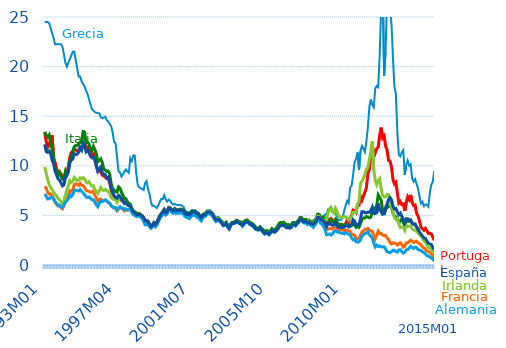
| Category |  Grecia | Portugal | Francia | Italia | Irlanda | Alemania | España |
|---|---|---|---|---|---|---|---|
| 1993M01 | 24.5 | 13.34 | 7.92 | 13.43 | 9.88 | 7.15 | 12.16 |
| 1993M02 | 24.5 | 12.46 | 7.77 | 13.06 | 9.26 | 6.94 | 11.43 |
| 1993M03 | 24.5 | 11.85 | 7.33 | 12.9 | 8.62 | 6.66 | 11.36 |
| 1993M04 | 24.38 | 12.06 | 7.15 | 13.11 | 8.11 | 6.68 | 11.49 |
| 1993M05 | 23.88 | 12.77 | 7.18 | 12.46 | 7.83 | 6.83 | 11.22 |
| 1993M06 | 23.38 | 13.07 | 6.95 | 11.67 | 7.61 | 6.81 | 10.56 |
| 1993M07 | 22.88 | 10.66 | 6.76 | 11.1 | 7.32 | 6.62 | 10.22 |
| 1993M08 | 22.25 | 10.37 | 6.31 | 9.76 | 7.11 | 6.41 | 9.48 |
| 1993M09 | 22.25 | 9.74 | 6.13 | 9.47 | 7.01 | 6.2 | 9.09 |
| 1993M10 | 22.25 | 9.27 | 5.96 | 9.02 | 6.71 | 6 | 8.69 |
| 1993M11 | 22.25 | 9.39 | 6.04 | 9.33 | 6.57 | 5.98 | 8.56 |
| 1993M12 | 22.25 | 9.19 | 5.8 | 8.93 | 6.38 | 5.85 | 8.28 |
| 1994M01 | 22 | 8.93 | 5.67 | 8.67 | 6.15 | 5.8 | 7.98 |
| 1994M02 | 21.25 | 8.58 | 5.94 | 8.77 | 6.45 | 6.07 | 8.07 |
| 1994M03 | 20.38 | 8.97 | 6.37 | 9.44 | 7.07 | 6.34 | 8.82 |
| 1994M04 | 20 | 9.26 | 6.69 | 9.05 | 7.57 | 6.48 | 9.07 |
| 1994M05 | 20.38 | 9.96 | 6.97 | 9.37 | 7.96 | 6.66 | 9.55 |
| 1994M06 | 20.75 | 10.84 | 7.49 | 10.48 | 8.5 | 7.05 | 10.28 |
| 1994M07 | 21.13 | 11.34 | 7.4 | 10.77 | 8.34 | 6.9 | 10.59 |
| 1994M08 | 21.5 | 11.42 | 7.61 | 11.46 | 8.43 | 7.09 | 10.68 |
| 1994M09 | 21.5 | 11.75 | 8.1 | 11.94 | 8.82 | 7.52 | 11.22 |
| 1994M10 | 20.67 | 11.59 | 8.19 | 12.07 | 8.68 | 7.54 | 11.14 |
| 1994M11 | 19.83 | 11.51 | 8.14 | 12.02 | 8.51 | 7.49 | 11.17 |
| 1994M12 | 19 | 11.6 | 8.02 | 12.2 | 8.57 | 7.46 | 11.38 |
| 1995M01 | 19 | 11.79 | 8.23 | 12.37 | 8.79 | 7.6 | 11.86 |
| 1995M02 | 18.5 | 11.7 | 8.01 | 12.39 | 8.67 | 7.42 | 11.6 |
| 1995M03 | 18.25 | 11.98 | 8.02 | 13.45 | 8.8 | 7.28 | 12.26 |
| 1995M04 | 18 | 12.17 | 7.82 | 13.4 | 8.7 | 7.09 | 12.09 |
| 1995M05 | 17.58 | 11.92 | 7.52 | 12.3 | 8.34 | 6.86 | 11.41 |
| 1995M06 | 17.24 | 11.89 | 7.45 | 12.38 | 8.26 | 6.78 | 11.54 |
| 1995M07 | 16.72 | 11.69 | 7.43 | 12.21 | 8.39 | 6.86 | 11.33 |
| 1995M08 | 16.19 | 11.31 | 7.33 | 11.66 | 8.15 | 6.74 | 10.97 |
| 1995M09 | 15.72 | 11.14 | 7.35 | 11.54 | 7.96 | 6.59 | 10.8 |
| 1995M10 | 15.56 | 11.22 | 7.48 | 11.96 | 7.99 | 6.57 | 10.89 |
| 1995M11 | 15.4 | 10.74 | 7.03 | 11.63 | 7.63 | 6.34 | 10.54 |
| 1995M12 | 15.35 | 10.03 | 6.75 | 11.17 | 7.38 | 6.07 | 9.95 |
| 1996M01 | 15.3 | 9.44 | 6.44 | 10.43 | 7.23 | 5.89 | 9.46 |
| 1996M02 | 15.3 | 9.45 | 6.59 | 10.52 | 7.49 | 6.2 | 9.71 |
| 1996M03 | 14.9 | 9.46 | 6.64 | 10.69 | 7.82 | 6.44 | 9.89 |
| 1996M04 | 14.8 | 9.06 | 6.5 | 10.34 | 7.61 | 6.38 | 9.33 |
| 1996M05 | 14.87 | 8.97 | 6.46 | 9.7 | 7.5 | 6.45 | 9.17 |
| 1996M06 | 14.95 | 8.88 | 6.55 | 9.57 | 7.62 | 6.56 | 9.11 |
| 1996M07 | 14.61 | 8.71 | 6.44 | 9.43 | 7.49 | 6.48 | 8.78 |
| 1996M08 | 14.46 | 8.71 | 6.34 | 9.48 | 7.43 | 6.3 | 8.86 |
| 1996M09 | 14.23 | 8.32 | 6.23 | 9.17 | 7.21 | 6.23 | 8.43 |
| 1996M10 | 14 | 7.59 | 5.97 | 8.23 | 6.78 | 6.01 | 7.76 |
| 1996M11 | 13.36 | 7.17 | 5.83 | 7.69 | 6.68 | 5.86 | 7.34 |
| 1996M12 | 12.42 | 6.95 | 5.74 | 7.56 | 6.61 | 5.79 | 7 |
| 1997M01 | 12.29 | 6.72 | 5.68 | 7.38 | 6.59 | 5.8 | 6.83 |
| 1997M02 | 10.87 | 6.66 | 5.46 | 7.36 | 6.32 | 5.55 | 6.74 |
| 1997M03 | 9.45 | 6.87 | 5.65 | 7.87 | 6.62 | 5.71 | 7.03 |
| 1997M04 | 9.33 | 6.8 | 5.8 | 7.74 | 6.69 | 5.87 | 6.95 |
| 1997M05 | 8.92 | 6.49 | 5.69 | 7.32 | 6.54 | 5.76 | 6.61 |
| 1997M06 | 9.15 | 6.41 | 5.65 | 7.07 | 6.49 | 5.72 | 6.47 |
| 1997M07 | 9.42 | 6.26 | 5.47 | 6.52 | 6.26 | 5.56 | 6.21 |
| 1997M08 | 9.63 | 6.35 | 5.58 | 6.66 | 6.33 | 5.66 | 6.31 |
| 1997M09 | 9.43 | 6.13 | 5.52 | 6.36 | 6.1 | 5.59 | 6.09 |
| 1997M10 | 9.3 | 5.98 | 5.59 | 6.2 | 5.99 | 5.58 | 5.98 |
| 1997M11 | 10.76 | 5.96 | 5.57 | 6.13 | 5.98 | 5.56 | 5.96 |
| 1997M12 | 10.48 | 5.67 | 5.32 | 5.74 | 5.61 | 5.33 | 5.64 |
| 1998M01 | 11.03 | 5.4 | 5.11 | 5.43 | 5.35 | 5.11 | 5.4 |
| 1998M02 | 11.04 | 5.32 | 5.03 | 5.38 | 5.23 | 4.99 | 5.24 |
| 1998M03 | 9.27 | 5.25 | 4.95 | 5.2 | 5.08 | 4.9 | 5.09 |
| 1998M04 | 8.11 | 5.17 | 4.96 | 5.15 | 5.05 | 4.9 | 5.06 |
| 1998M05 | 7.85 | 5.18 | 5.01 | 5.21 | 5.14 | 4.96 | 5.13 |
| 1998M06 | 7.74 | 5.06 | 4.86 | 5.08 | 5.03 | 4.8 | 5.02 |
| 1998M07 | 7.67 | 4.95 | 4.78 | 4.97 | 4.93 | 4.68 | 4.94 |
| 1998M08 | 7.56 | 4.76 | 4.52 | 4.79 | 4.68 | 4.42 | 4.74 |
| 1998M09 | 8.25 | 4.46 | 4.2 | 4.53 | 4.38 | 4.06 | 4.48 |
| 1998M10 | 8.45 | 4.44 | 4.17 | 4.49 | 4.35 | 4.06 | 4.43 |
| 1998M11 | 7.65 | 4.42 | 4.18 | 4.38 | 4.32 | 4.12 | 4.4 |
| 1998M12 | 7.17 | 4.12 | 3.91 | 4 | 4.02 | 3.86 | 4.07 |
| 1999M01 | 6.32 | 3.9 | 3.77 | 3.92 | 3.89 | 3.7 | 3.88 |
| 1999M02 | 5.96 | 4.02 | 3.93 | 4.05 | 4.02 | 3.85 | 4.02 |
| 1999M03 | 5.97 | 4.24 | 4.13 | 4.27 | 4.19 | 4.04 | 4.26 |
| 1999M04 | 5.85 | 4.13 | 3.98 | 4.11 | 3.95 | 3.85 | 4.08 |
| 1999M05 | 5.75 | 4.32 | 4.16 | 4.28 | 4.18 | 4.01 | 4.28 |
| 1999M06 | 6.02 | 4.66 | 4.47 | 4.62 | 4.59 | 4.36 | 4.6 |
| 1999M07 | 6.37 | 4.99 | 4.81 | 4.94 | 4.94 | 4.68 | 4.91 |
| 1999M08 | 6.66 | 5.22 | 5.01 | 5.13 | 5.16 | 4.88 | 5.17 |
| 1999M09 | 6.64 | 5.41 | 5.19 | 5.28 | 5.34 | 5.04 | 5.32 |
| 1999M10 | 7.03 | 5.62 | 5.43 | 5.52 | 5.57 | 5.29 | 5.56 |
| 1999M11 | 6.61 | 5.36 | 5.15 | 5.25 | 5.31 | 5.04 | 5.28 |
| 1999M12 | 6.39 | 5.46 | 5.27 | 5.36 | 5.39 | 5.15 | 5.37 |
| 2000M01 | 6.6 | 5.81 | 5.66 | 5.75 | 5.8 | 5.54 | 5.76 |
| 2000M02 | 6.48 | 5.78 | 5.62 | 5.73 | 5.76 | 5.51 | 5.73 |
| 2000M03 | 6.24 | 5.61 | 5.43 | 5.58 | 5.58 | 5.33 | 5.55 |
| 2000M04 | 6.09 | 5.52 | 5.33 | 5.47 | 5.46 | 5.22 | 5.45 |
| 2000M05 | 6.18 | 5.68 | 5.5 | 5.66 | 5.61 | 5.38 | 5.63 |
| 2000M06 | 6.06 | 5.54 | 5.32 | 5.51 | 5.43 | 5.19 | 5.45 |
| 2000M07 | 6.08 | 5.61 | 5.4 | 5.59 | 5.52 | 5.27 | 5.53 |
| 2000M08 | 6.04 | 5.57 | 5.36 | 5.56 | 5.47 | 5.21 | 5.5 |
| 2000M09 | 6.05 | 5.63 | 5.42 | 5.63 | 5.52 | 5.26 | 5.56 |
| 2000M10 | 5.97 | 5.58 | 5.36 | 5.58 | 5.46 | 5.21 | 5.5 |
| 2000M11 | 5.87 | 5.53 | 5.29 | 5.55 | 5.4 | 5.15 | 5.45 |
| 2000M12 | 5.54 | 5.28 | 5.04 | 5.3 | 5.14 | 4.89 | 5.2 |
| 2001M01 | 5.35 | 5.16 | 4.94 | 5.18 | 5.03 | 4.8 | 5.08 |
| 2001M02 | 5.35 | 5.14 | 4.93 | 5.18 | 5.01 | 4.78 | 5.12 |
| 2001M03 | 5.28 | 5.09 | 4.84 | 5.13 | 4.92 | 4.67 | 5.04 |
| 2001M04 | 5.39 | 5.26 | 5 | 5.28 | 5.09 | 4.83 | 5.18 |
| 2001M05 | 5.54 | 5.42 | 5.21 | 5.45 | 5.28 | 5.05 | 5.36 |
| 2001M06 | 5.48 | 5.38 | 5.15 | 5.4 | 5.23 | 5 | 5.33 |
| 2001M07 | 5.51 | 5.39 | 5.15 | 5.42 | 5.23 | 5.02 | 5.35 |
| 2001M08 | 5.33 | 5.19 | 4.95 | 5.22 | 5.01 | 4.82 | 5.16 |
| 2001M09 | 5.31 | 5.17 | 4.94 | 5.2 | 5.01 | 4.81 | 5.14 |
| 2001M10 | 5.07 | 4.92 | 4.72 | 4.96 | 4.77 | 4.6 | 4.91 |
| 2001M11 | 4.9 | 4.76 | 4.57 | 4.8 | 4.63 | 4.45 | 4.76 |
| 2001M12 | 5.13 | 5.01 | 4.87 | 5.05 | 4.93 | 4.74 | 4.97 |
| 2002M01 | 5.24 | 5.08 | 4.93 | 5.14 | 5.02 | 4.86 | 5.05 |
| 2002M02 | 5.31 | 5.15 | 4.99 | 5.2 | 5.2 | 4.92 | 5.11 |
| 2002M03 | 5.5 | 5.39 | 5.24 | 5.41 | 5.42 | 5.16 | 5.34 |
| 2002M04 | 5.51 | 5.39 | 5.24 | 5.4 | 5.41 | 5.15 | 5.34 |
| 2002M05 | 5.52 | 5.4 | 5.26 | 5.41 | 5.41 | 5.17 | 5.36 |
| 2002M06 | 5.37 | 5.26 | 5.11 | 5.26 | 5.25 | 5.02 | 5.23 |
| 2002M07 | 5.21 | 5.12 | 4.96 | 5.11 | 5.11 | 4.87 | 5.07 |
| 2002M08 | 4.95 | 4.85 | 4.67 | 4.83 | 4.84 | 4.59 | 4.78 |
| 2002M09 | 4.73 | 4.63 | 4.46 | 4.62 | 4.63 | 4.38 | 4.57 |
| 2002M10 | 4.79 | 4.7 | 4.55 | 4.76 | 4.7 | 4.46 | 4.63 |
| 2002M11 | 4.76 | 4.66 | 4.53 | 4.74 | 4.67 | 4.48 | 4.6 |
| 2002M12 | 4.58 | 4.45 | 4.38 | 4.55 | 4.46 | 4.33 | 4.42 |
| 2003M01 | 4.43 | 4.27 | 4.22 | 4.38 | 4.27 | 4.18 | 4.24 |
| 2003M02 | 4.24 | 4.04 | 4.01 | 4.16 | 4.06 | 3.95 | 4.01 |
| 2003M03 | 4.26 | 4.08 | 4.1 | 4.18 | 4.09 | 4 | 4.04 |
| 2003M04 | 4.38 | 4.18 | 4.22 | 4.31 | 4.22 | 4.15 | 4.19 |
| 2003M05 | 4.02 | 3.91 | 3.89 | 4.04 | 3.89 | 3.82 | 3.88 |
| 2003M06 | 3.81 | 3.77 | 3.69 | 3.82 | 3.69 | 3.62 | 3.69 |
| 2003M07 | 4.12 | 4.1 | 4.01 | 4.13 | 4.01 | 3.97 | 4.03 |
| 2003M08 | 4.29 | 4.26 | 4.16 | 4.29 | 4.17 | 4.13 | 4.19 |
| 2003M09 | 4.32 | 4.29 | 4.23 | 4.31 | 4.19 | 4.17 | 4.21 |
| 2003M10 | 4.38 | 4.36 | 4.28 | 4.38 | 4.25 | 4.22 | 4.27 |
| 2003M11 | 4.51 | 4.48 | 4.41 | 4.51 | 4.39 | 4.35 | 4.4 |
| 2003M12 | 4.45 | 4.4 | 4.34 | 4.46 | 4.36 | 4.29 | 4.34 |
| 2004M01 | 4.37 | 4.25 | 4.2 | 4.32 | 4.2 | 4.17 | 4.19 |
| 2004M02 | 4.35 | 4.19 | 4.14 | 4.34 | 4.15 | 4.11 | 4.14 |
| 2004M03 | 4.17 | 4 | 3.98 | 4.17 | 3.97 | 3.91 | 4.01 |
| 2004M04 | 4.35 | 4.25 | 4.18 | 4.35 | 4.17 | 4.1 | 4.2 |
| 2004M05 | 4.49 | 4.42 | 4.34 | 4.49 | 4.31 | 4.25 | 4.33 |
| 2004M06 | 4.55 | 4.47 | 4.39 | 4.54 | 4.38 | 4.31 | 4.39 |
| 2004M07 | 4.44 | 4.35 | 4.27 | 4.44 | 4.27 | 4.24 | 4.28 |
| 2004M08 | 4.28 | 4.18 | 4.11 | 4.28 | 4.09 | 4.08 | 4.15 |
| 2004M09 | 4.22 | 4.12 | 4.09 | 4.25 | 4.04 | 4.02 | 4.08 |
| 2004M10 | 4.11 | 3.99 | 3.98 | 4.13 | 3.92 | 3.89 | 3.97 |
| 2004M11 | 3.97 | 3.86 | 3.86 | 4 | 3.8 | 3.78 | 3.85 |
| 2004M12 | 3.77 | 3.64 | 3.64 | 3.79 | 3.62 | 3.58 | 3.64 |
| 2005M01 | 3.69 | 3.56 | 3.58 | 3.71 | 3.52 | 3.56 | 3.59 |
| 2005M02 | 3.69 | 3.55 | 3.6 | 3.68 | 3.51 | 3.54 | 3.58 |
| 2005M03 | 3.92 | 3.7 | 3.75 | 3.84 | 3.66 | 3.7 | 3.74 |
| 2005M04 | 3.76 | 3.5 | 3.54 | 3.65 | 3.46 | 3.48 | 3.53 |
| 2005M05 | 3.6 | 3.35 | 3.38 | 3.55 | 3.28 | 3.3 | 3.36 |
| 2005M06 | 3.44 | 3.19 | 3.2 | 3.4 | 3.13 | 3.13 | 3.18 |
| 2005M07 | 3.46 | 3.35 | 3.27 | 3.44 | 3.18 | 3.2 | 3.22 |
| 2005M08 | 3.47 | 3.39 | 3.3 | 3.45 | 3.22 | 3.23 | 3.23 |
| 2005M09 | 3.3 | 3.23 | 3.13 | 3.29 | 3.04 | 3.07 | 3.09 |
| 2005M10 | 3.45 | 3.39 | 3.29 | 3.44 | 3.19 | 3.24 | 3.28 |
| 2005M11 | 3.67 | 3.58 | 3.5 | 3.66 | 3.4 | 3.45 | 3.48 |
| 2005M12 | 3.57 | 3.46 | 3.38 | 3.55 | 3.36 | 3.34 | 3.37 |
| 2006M01 | 3.6 | 3.45 | 3.34 | 3.54 | 3.32 | 3.32 | 3.33 |
| 2006M02 | 3.77 | 3.6 | 3.51 | 3.7 | 3.47 | 3.47 | 3.48 |
| 2006M03 | 3.95 | 3.77 | 3.69 | 3.92 | 3.65 | 3.64 | 3.66 |
| 2006M04 | 4.23 | 4.03 | 3.95 | 4.22 | 3.9 | 3.89 | 3.92 |
| 2006M05 | 4.3 | 4.07 | 4 | 4.28 | 3.96 | 3.96 | 3.99 |
| 2006M06 | 4.31 | 4.1 | 4.01 | 4.3 | 3.98 | 3.96 | 3.99 |
| 2006M07 | 4.33 | 4.14 | 4.03 | 4.31 | 4 | 4.01 | 4.02 |
| 2006M08 | 4.19 | 4.06 | 3.9 | 4.17 | 3.88 | 3.88 | 3.89 |
| 2006M09 | 4.06 | 3.93 | 3.77 | 4.04 | 3.76 | 3.75 | 3.76 |
| 2006M10 | 4.08 | 3.98 | 3.81 | 4.07 | 3.78 | 3.79 | 3.81 |
| 2006M11 | 3.98 | 3.89 | 3.74 | 3.97 | 3.72 | 3.71 | 3.75 |
| 2006M12 | 4.04 | 3.96 | 3.81 | 4.04 | 3.76 | 3.77 | 3.82 |
| 2007M01 | 4.28 | 4.18 | 4.07 | 4.26 | 4.04 | 4.02 | 4.07 |
| 2007M02 | 4.3 | 4.19 | 4.1 | 4.28 | 4.07 | 4.05 | 4.1 |
| 2007M03 | 4.2 | 4.1 | 4 | 4.18 | 3.97 | 3.94 | 4.01 |
| 2007M04 | 4.4 | 4.3 | 4.21 | 4.37 | 4.19 | 4.15 | 4.21 |
| 2007M05 | 4.51 | 4.44 | 4.34 | 4.49 | 4.32 | 4.28 | 4.34 |
| 2007M06 | 4.8 | 4.74 | 4.62 | 4.77 | 4.62 | 4.56 | 4.62 |
| 2007M07 | 4.79 | 4.73 | 4.58 | 4.76 | 4.59 | 4.5 | 4.6 |
| 2007M08 | 4.62 | 4.56 | 4.39 | 4.58 | 4.4 | 4.3 | 4.4 |
| 2007M09 | 4.56 | 4.5 | 4.36 | 4.57 | 4.32 | 4.22 | 4.36 |
| 2007M10 | 4.58 | 4.52 | 4.4 | 4.59 | 4.39 | 4.28 | 4.38 |
| 2007M11 | 4.43 | 4.36 | 4.23 | 4.45 | 4.31 | 4.09 | 4.25 |
| 2007M12 | 4.53 | 4.47 | 4.35 | 4.54 | 4.45 | 4.21 | 4.35 |
| 2008M01 | 4.4 | 4.31 | 4.15 | 4.4 | 4.25 | 4.03 | 4.18 |
| 2008M02 | 4.36 | 4.27 | 4.08 | 4.35 | 4.21 | 3.95 | 4.15 |
| 2008M03 | 4.42 | 4.36 | 4.02 | 4.38 | 4.17 | 3.8 | 4.12 |
| 2008M04 | 4.54 | 4.52 | 4.27 | 4.53 | 4.44 | 4.04 | 4.32 |
| 2008M05 | 4.74 | 4.6 | 4.41 | 4.7 | 4.58 | 4.2 | 4.43 |
| 2008M06 | 5.17 | 4.96 | 4.73 | 5.11 | 4.91 | 4.52 | 4.79 |
| 2008M07 | 5.15 | 4.95 | 4.69 | 5.1 | 4.92 | 4.49 | 4.8 |
| 2008M08 | 4.87 | 4.69 | 4.4 | 4.81 | 4.59 | 4.2 | 4.56 |
| 2008M09 | 4.88 | 4.66 | 4.36 | 4.8 | 4.56 | 4.09 | 4.57 |
| 2008M10 | 4.93 | 4.56 | 4.18 | 4.78 | 4.55 | 3.88 | 4.46 |
| 2008M11 | 5.09 | 4.35 | 3.98 | 4.74 | 4.56 | 3.56 | 4.15 |
| 2008M12 | 5.08 | 4 | 3.54 | 4.47 | 4.57 | 3.05 | 3.86 |
| 2009M01 | 5.6 | 4.32 | 3.6 | 4.62 | 5.2 | 3.07 | 4.15 |
| 2009M02 | 5.7 | 4.52 | 3.68 | 4.54 | 5.65 | 3.13 | 4.23 |
| 2009M03 | 5.87 | 4.68 | 3.65 | 4.46 | 5.76 | 3.02 | 4.06 |
| 2009M04 | 5.5 | 4.53 | 3.66 | 4.36 | 5.34 | 3.13 | 4.01 |
| 2009M05 | 5.22 | 4.29 | 3.8 | 4.42 | 5.27 | 3.37 | 4.06 |
| 2009M06 | 5.33 | 4.5 | 3.9 | 4.61 | 5.73 | 3.47 | 4.25 |
| 2009M07 | 4.89 | 4.25 | 3.73 | 4.37 | 5.45 | 3.34 | 4.01 |
| 2009M08 | 4.52 | 3.95 | 3.59 | 4.12 | 4.92 | 3.31 | 3.79 |
| 2009M09 | 4.56 | 3.94 | 3.59 | 4.09 | 4.91 | 3.26 | 3.81 |
| 2009M10 | 4.57 | 3.85 | 3.56 | 4.1 | 4.77 | 3.21 | 3.78 |
| 2009M11 | 4.84 | 3.8 | 3.56 | 4.06 | 4.82 | 3.22 | 3.79 |
| 2009M12 | 5.49 | 3.91 | 3.48 | 4.01 | 4.88 | 3.14 | 3.81 |
| 2010M01 | 6.02 | 4.17 | 3.52 | 4.08 | 4.83 | 3.26 | 3.99 |
| 2010M02 | 6.46 | 4.56 | 3.5 | 4.05 | 4.73 | 3.17 | 3.98 |
| 2010M03 | 6.24 | 4.31 | 3.44 | 3.94 | 4.53 | 3.1 | 3.83 |
| 2010M04 | 7.83 | 4.78 | 3.4 | 4 | 4.76 | 3.06 | 3.9 |
| 2010M05 | 7.97 | 5.02 | 3.08 | 3.98 | 4.86 | 2.73 | 4.08 |
| 2010M06 | 9.1 | 5.54 | 3.07 | 4.1 | 5.31 | 2.54 | 4.56 |
| 2010M07 | 10.34 | 5.49 | 2.99 | 4.03 | 5.32 | 2.62 | 4.43 |
| 2010M08 | 10.7 | 5.31 | 2.68 | 3.8 | 5.3 | 2.35 | 4.04 |
| 2010M09 | 11.34 | 6.08 | 2.68 | 3.86 | 6.14 | 2.3 | 4.09 |
| 2010M10 | 9.57 | 6.05 | 2.72 | 3.8 | 6.42 | 2.35 | 4.04 |
| 2010M11 | 11.52 | 6.91 | 3 | 4.18 | 8.22 | 2.53 | 4.69 |
| 2010M12 | 12.01 | 6.53 | 3.34 | 4.6 | 8.45 | 2.91 | 5.38 |
| 2011M01 | 11.73 | 6.95 | 3.44 | 4.73 | 8.75 | 3.02 | 5.38 |
| 2011M02 | 11.4 | 7.34 | 3.6 | 4.74 | 9.1 | 3.2 | 5.26 |
| 2011M03 | 12.44 | 7.8 | 3.61 | 4.88 | 9.67 | 3.21 | 5.25 |
| 2011M04 | 13.86 | 9.19 | 3.69 | 4.84 | 9.79 | 3.34 | 5.33 |
| 2011M05 | 15.94 | 9.63 | 3.49 | 4.76 | 10.64 | 3.06 | 5.32 |
| 2011M06 | 16.69 | 10.87 | 3.43 | 4.82 | 11.43 | 2.89 | 5.48 |
| 2011M07 | 16.15 | 12.15 | 3.4 | 5.46 | 12.45 | 2.74 | 5.83 |
| 2011M08 | 15.9 | 10.93 | 2.98 | 5.27 | 9.57 | 2.21 | 5.25 |
| 2011M09 | 17.78 | 11.34 | 2.64 | 5.75 | 8.51 | 1.83 | 5.2 |
| 2011M10 | 18.04 | 11.72 | 2.99 | 5.97 | 8.1 | 2 | 5.26 |
| 2011M11 | 17.92 | 11.89 | 3.41 | 7.06 | 8.51 | 1.87 | 6.2 |
| 2011M12 | 21.14 | 13.08 | 3.16 | 6.81 | 8.7 | 1.93 | 5.53 |
| 2012M01 | 25.91 | 13.85 | 3.18 | 6.54 | 7.71 | 1.82 | 5.41 |
| 2012M02 | 29.24 | 12.81 | 3.02 | 5.55 | 7.02 | 1.85 | 5.11 |
| 2012M03 | 19.07 | 13.01 | 2.95 | 5.05 | 6.9 | 1.83 | 5.17 |
| 2012M04 | 21.48 | 12.01 | 2.99 | 5.68 | 6.88 | 1.62 | 5.79 |
| 2012M05 | 26.9 | 11.59 | 2.75 | 5.78 | 7.12 | 1.34 | 6.13 |
| 2012M06 | 27.82 | 10.56 | 2.57 | 5.9 | 7.09 | 1.3 | 6.59 |
| 2012M07 | 25.82 | 10.49 | 2.28 | 6 | 6.12 | 1.24 | 6.79 |
| 2012M08 | 24.34 | 9.89 | 2.12 | 5.82 | 5.91 | 1.34 | 6.58 |
| 2012M09 | 20.91 | 8.62 | 2.24 | 5.25 | 5.28 | 1.49 | 5.91 |
| 2012M10 | 17.96 | 8.17 | 2.19 | 4.95 | 4.77 | 1.47 | 5.64 |
| 2012M11 | 17.2 | 8.32 | 2.14 | 4.85 | 4.59 | 1.34 | 5.69 |
| 2012M12 | 13.33 | 7.25 | 2.01 | 4.54 | 4.67 | 1.3 | 5.34 |
| 2013M01 | 11.1 | 6.24 | 2.17 | 4.21 | 4.18 | 1.51 | 5.05 |
| 2013M02 | 10.95 | 6.4 | 2.24 | 4.49 | 3.78 | 1.54 | 5.22 |
| 2013M03 | 11.38 | 6.1 | 2.07 | 4.64 | 3.83 | 1.35 | 4.92 |
| 2013M04 | 11.58 | 6.15 | 1.8 | 4.28 | 3.78 | 1.2 | 4.59 |
| 2013M05 | 9.07 | 5.46 | 1.87 | 3.96 | 3.48 | 1.29 | 4.25 |
| 2013M06 | 10.07 | 6.3 | 2.21 | 4.38 | 4.02 | 1.53 | 4.67 |
| 2013M07 | 10.53 | 6.87 | 2.25 | 4.42 | 3.88 | 1.56 | 4.67 |
| 2013M08 | 10.01 | 6.6 | 2.36 | 4.42 | 3.92 | 1.73 | 4.5 |
| 2013M09 | 10.15 | 7.06 | 2.49 | 4.54 | 3.95 | 1.89 | 4.42 |
| 2013M10 | 8.74 | 6.33 | 2.39 | 4.25 | 3.65 | 1.76 | 4.22 |
| 2013M11 | 8.41 | 5.98 | 2.27 | 4.1 | 3.53 | 1.68 | 4.1 |
| 2013M12 | 8.66 | 6.04 | 2.33 | 4.11 | 3.48 | 1.8 | 4.13 |
| 2014M01 | 8.18 | 5.21 | 2.38 | 3.87 | 3.39 | 1.76 | 3.79 |
| 2014M02 | 7.7 | 4.94 | 2.25 | 3.65 | 3.24 | 1.56 | 3.56 |
| 2014M03 | 6.9 | 4.43 | 2.15 | 3.4 | 3.05 | 1.51 | 3.31 |